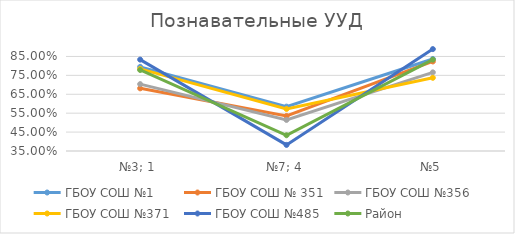
| Category | ГБОУ СОШ №1 | ГБОУ СОШ № 351 | ГБОУ СОШ №356 | ГБОУ СОШ №371 | ГБОУ СОШ №485 | Район |
|---|---|---|---|---|---|---|
| №3; 1 | 0.795 | 0.681 | 0.704 | 0.784 | 0.833 | 0.778 |
| №7; 4 | 0.585 | 0.535 | 0.514 | 0.572 | 0.382 | 0.433 |
| №5 | 0.836 | 0.824 | 0.766 | 0.737 | 0.889 | 0.833 |